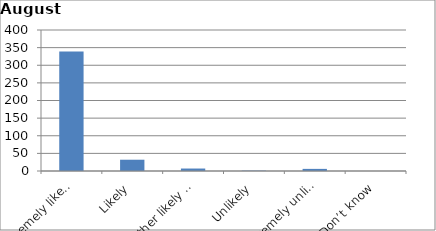
| Category | Series 0 |
|---|---|
| Extremely likely | 339 |
| Likely | 32 |
| Neither likely nor unlikely | 7 |
| Unlikely | 1 |
| Extremely unlikely | 6 |
| Don’t know | 0 |